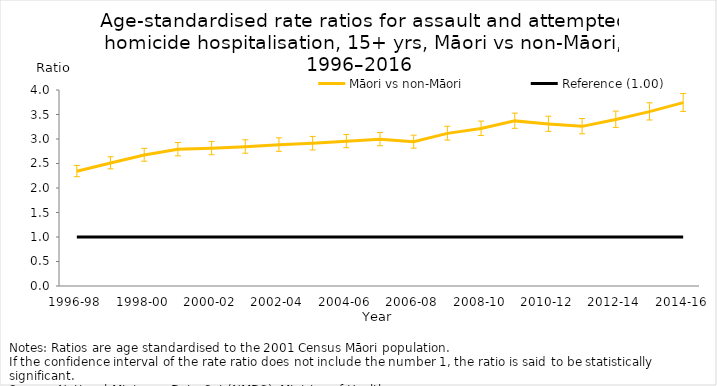
| Category | Māori vs non-Māori | Reference (1.00) |
|---|---|---|
| 1996-98 | 2.342 | 1 |
| 1997-99 | 2.511 | 1 |
| 1998-00 | 2.675 | 1 |
| 1999-01 | 2.789 | 1 |
| 2000-02 | 2.811 | 1 |
| 2001-03 | 2.844 | 1 |
| 2002-04 | 2.882 | 1 |
| 2003-05 | 2.911 | 1 |
| 2004-06 | 2.954 | 1 |
| 2005-07 | 2.994 | 1 |
| 2006-08 | 2.943 | 1 |
| 2007-09 | 3.115 | 1 |
| 2008-10 | 3.216 | 1 |
| 2009-11 | 3.37 | 1 |
| 2010-12 | 3.307 | 1 |
| 2011-13 | 3.258 | 1 |
| 2012-14 | 3.399 | 1 |
| 2013-15 | 3.559 | 1 |
| 2014-16 | 3.741 | 1 |